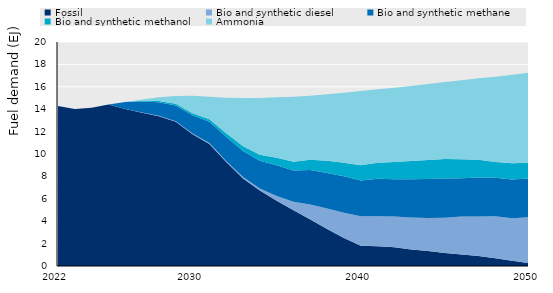
| Category | Fossil | Bio and synthetic diesel | Bio and synthetic methane | Bio and synthetic methanol | Ammonia |
|---|---|---|---|---|---|
| 2022.0 | 14.296 | 0 | 0 | 0 | 0 |
| nan | 14.009 | 0 | 0 | 0 | 0 |
| nan | 14.138 | 0 | 0 | 0 | 0 |
| nan | 14.421 | 0 | 0 | 0 | 0 |
| nan | 14.014 | 0.002 | 0.625 | 0.009 | 0 |
| nan | 13.688 | 0.024 | 0.971 | 0.081 | 0.099 |
| nan | 13.375 | 0.037 | 1.2 | 0.114 | 0.332 |
| nan | 12.87 | 0.048 | 1.421 | 0.142 | 0.687 |
| 2030.0 | 11.756 | 0.066 | 1.644 | 0.175 | 1.569 |
| nan | 10.901 | 0.081 | 1.894 | 0.217 | 2.015 |
| nan | 9.278 | 0.101 | 2.155 | 0.316 | 3.175 |
| nan | 7.821 | 0.129 | 2.315 | 0.432 | 4.298 |
| nan | 6.741 | 0.172 | 2.486 | 0.527 | 5.084 |
| nan | 5.833 | 0.42 | 2.753 | 0.653 | 5.398 |
| nan | 4.968 | 0.773 | 2.782 | 0.791 | 5.797 |
| nan | 4.143 | 1.35 | 3.073 | 0.929 | 5.704 |
| nan | 3.308 | 1.817 | 3.184 | 1.081 | 5.94 |
| nan | 2.49 | 2.255 | 3.26 | 1.217 | 6.242 |
| 2040.0 | 1.809 | 2.628 | 3.202 | 1.35 | 6.639 |
| nan | 1.77 | 2.668 | 3.361 | 1.423 | 6.55 |
| nan | 1.684 | 2.743 | 3.317 | 1.535 | 6.642 |
| nan | 1.469 | 2.854 | 3.425 | 1.633 | 6.698 |
| nan | 1.33 | 2.959 | 3.482 | 1.698 | 6.779 |
| nan | 1.167 | 3.136 | 3.509 | 1.743 | 6.869 |
| nan | 1.036 | 3.386 | 3.42 | 1.695 | 7.047 |
| nan | 0.903 | 3.523 | 3.481 | 1.586 | 7.263 |
| nan | 0.684 | 3.755 | 3.44 | 1.402 | 7.625 |
| nan | 0.471 | 3.799 | 3.453 | 1.451 | 7.905 |
| 2050.0 | 0.261 | 4.104 | 3.463 | 1.401 | 8.028 |